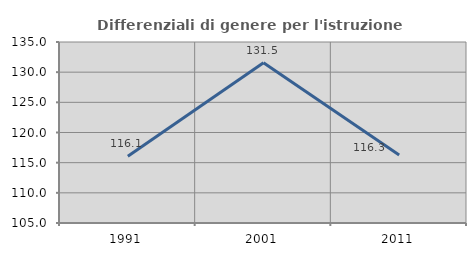
| Category | Differenziali di genere per l'istruzione superiore |
|---|---|
| 1991.0 | 116.063 |
| 2001.0 | 131.55 |
| 2011.0 | 116.288 |